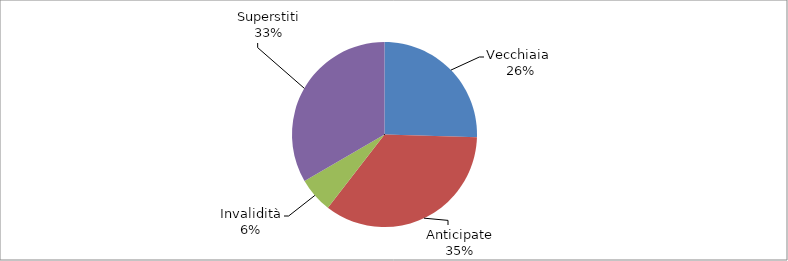
| Category | Series 0 |
|---|---|
| Vecchiaia  | 24272 |
| Anticipate | 33334 |
| Invalidità | 5849 |
| Superstiti | 31779 |